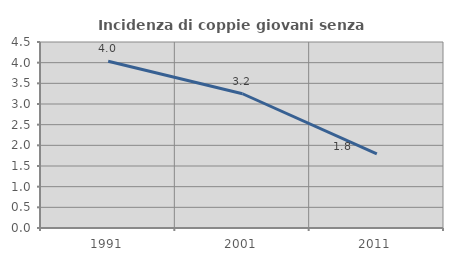
| Category | Incidenza di coppie giovani senza figli |
|---|---|
| 1991.0 | 4.033 |
| 2001.0 | 3.248 |
| 2011.0 | 1.793 |